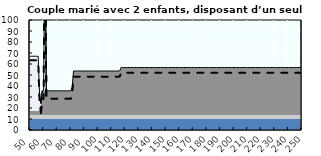
| Category | Coin fiscal marginal (somme des composantes) | Taux d’imposition marginal net |
|---|---|---|
| 50.0 | 67.042 | 63.4 |
| 51.0 | 67.042 | 63.4 |
| 52.0 | 67.042 | 63.4 |
| 53.0 | 67.042 | 63.4 |
| 54.0 | 67.042 | 63.4 |
| 55.0 | 67.042 | 63.4 |
| 56.0 | 67.042 | 63.4 |
| 57.0 | 33.573 | 26.233 |
| 58.0 | 24.086 | 15.697 |
| 59.0 | 35.615 | 28.5 |
| 60.0 | 35.615 | 28.5 |
| 61.0 | 191.963 | 202.125 |
| 62.0 | 35.615 | 28.5 |
| 63.0 | 35.615 | 28.5 |
| 64.0 | 35.615 | 28.5 |
| 65.0 | 35.615 | 28.5 |
| 66.0 | 35.615 | 28.5 |
| 67.0 | 35.615 | 28.5 |
| 68.0 | 35.615 | 28.5 |
| 69.0 | 35.615 | 28.5 |
| 70.0 | 35.615 | 28.5 |
| 71.0 | 35.615 | 28.5 |
| 72.0 | 35.615 | 28.5 |
| 73.0 | 35.615 | 28.5 |
| 74.0 | 35.615 | 28.5 |
| 75.0 | 35.615 | 28.5 |
| 76.0 | 35.615 | 28.5 |
| 77.0 | 35.615 | 28.5 |
| 78.0 | 35.615 | 28.5 |
| 79.0 | 35.615 | 28.5 |
| 80.0 | 35.615 | 28.5 |
| 81.0 | 39.144 | 32.42 |
| 82.0 | 53.624 | 48.5 |
| 83.0 | 53.624 | 48.5 |
| 84.0 | 53.624 | 48.5 |
| 85.0 | 53.624 | 48.5 |
| 86.0 | 53.624 | 48.5 |
| 87.0 | 53.624 | 48.5 |
| 88.0 | 53.624 | 48.5 |
| 89.0 | 53.624 | 48.5 |
| 90.0 | 53.624 | 48.5 |
| 91.0 | 53.624 | 48.5 |
| 92.0 | 53.624 | 48.5 |
| 93.0 | 53.624 | 48.5 |
| 94.0 | 53.624 | 48.5 |
| 95.0 | 53.624 | 48.5 |
| 96.0 | 53.624 | 48.5 |
| 97.0 | 53.624 | 48.5 |
| 98.0 | 53.624 | 48.5 |
| 99.0 | 53.624 | 48.5 |
| 100.0 | 53.624 | 48.5 |
| 101.0 | 53.624 | 48.5 |
| 102.0 | 53.624 | 48.5 |
| 103.0 | 53.624 | 48.5 |
| 104.0 | 53.624 | 48.5 |
| 105.0 | 53.624 | 48.5 |
| 106.0 | 53.624 | 48.5 |
| 107.0 | 53.624 | 48.5 |
| 108.0 | 53.624 | 48.5 |
| 109.0 | 53.624 | 48.5 |
| 110.0 | 53.624 | 48.5 |
| 111.0 | 53.624 | 48.5 |
| 112.0 | 53.624 | 48.5 |
| 113.0 | 53.624 | 48.5 |
| 114.0 | 53.624 | 48.5 |
| 115.0 | 53.624 | 48.5 |
| 116.0 | 53.825 | 48.723 |
| 117.0 | 56.776 | 52 |
| 118.0 | 56.776 | 52 |
| 119.0 | 56.776 | 52 |
| 120.0 | 56.776 | 52 |
| 121.0 | 56.776 | 52 |
| 122.0 | 56.776 | 52 |
| 123.0 | 56.776 | 52 |
| 124.0 | 56.776 | 52 |
| 125.0 | 56.776 | 52 |
| 126.0 | 56.776 | 52 |
| 127.0 | 56.776 | 52 |
| 128.0 | 56.776 | 52 |
| 129.0 | 56.776 | 52 |
| 130.0 | 56.776 | 52 |
| 131.0 | 56.776 | 52 |
| 132.0 | 56.776 | 52 |
| 133.0 | 56.776 | 52 |
| 134.0 | 56.776 | 52 |
| 135.0 | 56.776 | 52 |
| 136.0 | 56.776 | 52 |
| 137.0 | 56.776 | 52 |
| 138.0 | 56.776 | 52 |
| 139.0 | 56.776 | 52 |
| 140.0 | 56.776 | 52 |
| 141.0 | 56.776 | 52 |
| 142.0 | 56.776 | 52 |
| 143.0 | 56.776 | 52 |
| 144.0 | 56.776 | 52 |
| 145.0 | 56.776 | 52 |
| 146.0 | 56.776 | 52 |
| 147.0 | 56.776 | 52 |
| 148.0 | 56.776 | 52 |
| 149.0 | 56.776 | 52 |
| 150.0 | 56.776 | 52 |
| 151.0 | 56.776 | 52 |
| 152.0 | 56.776 | 52 |
| 153.0 | 56.776 | 52 |
| 154.0 | 56.776 | 52 |
| 155.0 | 56.776 | 52 |
| 156.0 | 56.776 | 52 |
| 157.0 | 56.776 | 52 |
| 158.0 | 56.776 | 52 |
| 159.0 | 56.776 | 52 |
| 160.0 | 56.776 | 52 |
| 161.0 | 56.776 | 52 |
| 162.0 | 56.776 | 52 |
| 163.0 | 56.776 | 52 |
| 164.0 | 56.776 | 52 |
| 165.0 | 56.776 | 52 |
| 166.0 | 56.776 | 52 |
| 167.0 | 56.776 | 52 |
| 168.0 | 56.776 | 52 |
| 169.0 | 56.776 | 52 |
| 170.0 | 56.776 | 52 |
| 171.0 | 56.776 | 52 |
| 172.0 | 56.776 | 52 |
| 173.0 | 56.776 | 52 |
| 174.0 | 56.776 | 52 |
| 175.0 | 56.776 | 52 |
| 176.0 | 56.776 | 52 |
| 177.0 | 56.776 | 52 |
| 178.0 | 56.776 | 52 |
| 179.0 | 56.776 | 52 |
| 180.0 | 56.776 | 52 |
| 181.0 | 56.776 | 52 |
| 182.0 | 56.776 | 52 |
| 183.0 | 56.776 | 52 |
| 184.0 | 56.776 | 52 |
| 185.0 | 56.776 | 52 |
| 186.0 | 56.776 | 52 |
| 187.0 | 56.776 | 52 |
| 188.0 | 56.776 | 52 |
| 189.0 | 56.776 | 52 |
| 190.0 | 56.776 | 52 |
| 191.0 | 56.776 | 52 |
| 192.0 | 56.776 | 52 |
| 193.0 | 56.776 | 52 |
| 194.0 | 56.776 | 52 |
| 195.0 | 56.776 | 52 |
| 196.0 | 56.776 | 52 |
| 197.0 | 56.776 | 52 |
| 198.0 | 56.776 | 52 |
| 199.0 | 56.776 | 52 |
| 200.0 | 56.776 | 52 |
| 201.0 | 56.776 | 52 |
| 202.0 | 56.776 | 52 |
| 203.0 | 56.776 | 52 |
| 204.0 | 56.776 | 52 |
| 205.0 | 56.776 | 52 |
| 206.0 | 56.776 | 52 |
| 207.0 | 56.776 | 52 |
| 208.0 | 56.776 | 52 |
| 209.0 | 56.776 | 52 |
| 210.0 | 56.776 | 52 |
| 211.0 | 56.776 | 52 |
| 212.0 | 56.776 | 52 |
| 213.0 | 56.776 | 52 |
| 214.0 | 56.776 | 52 |
| 215.0 | 56.776 | 52 |
| 216.0 | 56.776 | 52 |
| 217.0 | 56.776 | 52 |
| 218.0 | 56.776 | 52 |
| 219.0 | 56.776 | 52 |
| 220.0 | 56.776 | 52 |
| 221.0 | 56.776 | 52 |
| 222.0 | 56.776 | 52 |
| 223.0 | 56.776 | 52 |
| 224.0 | 56.776 | 52 |
| 225.0 | 56.776 | 52 |
| 226.0 | 56.776 | 52 |
| 227.0 | 56.776 | 52 |
| 228.0 | 56.776 | 52 |
| 229.0 | 56.776 | 52 |
| 230.0 | 56.776 | 52 |
| 231.0 | 56.776 | 52 |
| 232.0 | 56.776 | 52 |
| 233.0 | 56.776 | 52 |
| 234.0 | 56.776 | 52 |
| 235.0 | 56.776 | 52 |
| 236.0 | 56.776 | 52 |
| 237.0 | 56.776 | 52 |
| 238.0 | 56.776 | 52 |
| 239.0 | 56.776 | 52 |
| 240.0 | 56.776 | 52 |
| 241.0 | 56.776 | 52 |
| 242.0 | 56.776 | 52 |
| 243.0 | 56.776 | 52 |
| 244.0 | 56.776 | 52 |
| 245.0 | 56.776 | 52 |
| 246.0 | 56.776 | 52 |
| 247.0 | 56.776 | 52 |
| 248.0 | 56.776 | 52 |
| 249.0 | 56.776 | 52 |
| 250.0 | 56.776 | 52 |